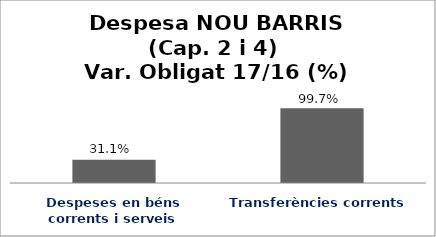
| Category | Series 0 |
|---|---|
| Despeses en béns corrents i serveis | 0.311 |
| Transferències corrents | 0.997 |